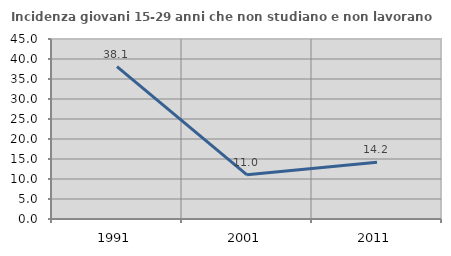
| Category | Incidenza giovani 15-29 anni che non studiano e non lavorano  |
|---|---|
| 1991.0 | 38.098 |
| 2001.0 | 11.039 |
| 2011.0 | 14.179 |